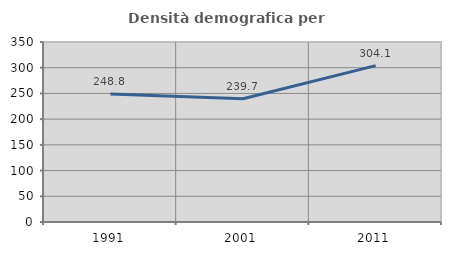
| Category | Densità demografica |
|---|---|
| 1991.0 | 248.771 |
| 2001.0 | 239.67 |
| 2011.0 | 304.053 |